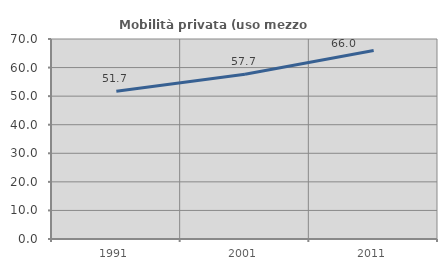
| Category | Mobilità privata (uso mezzo privato) |
|---|---|
| 1991.0 | 51.682 |
| 2001.0 | 57.692 |
| 2011.0 | 65.963 |